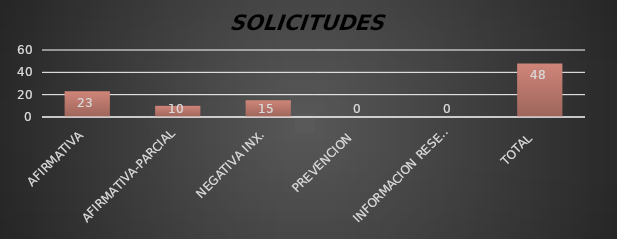
| Category | Series 1 |
|---|---|
| AFIRMATIVA | 23 |
| AFIRMATIVA-PARCIAL | 10 |
| NEGATIVA INX. | 15 |
| PREVENCION  | 0 |
| INFORMACION RESERVADA | 0 |
| TOTAL  | 48 |